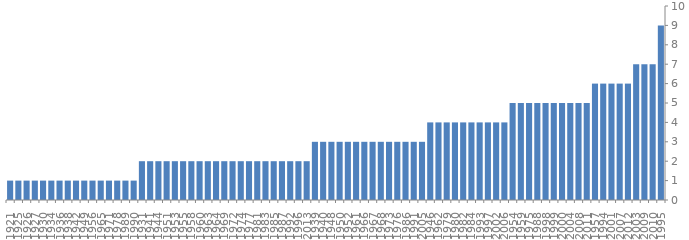
| Category | Series 0 |
|---|---|
| 1995.0 | 9 |
| 2010.0 | 7 |
| 2009.0 | 7 |
| 2003.0 | 7 |
| 2012.0 | 6 |
| 2007.0 | 6 |
| 2001.0 | 6 |
| 1994.0 | 6 |
| 1957.0 | 6 |
| 2011.0 | 5 |
| 2008.0 | 5 |
| 2004.0 | 5 |
| 2000.0 | 5 |
| 1999.0 | 5 |
| 1998.0 | 5 |
| 1988.0 | 5 |
| 1975.0 | 5 |
| 1959.0 | 5 |
| 1954.0 | 5 |
| 2006.0 | 4 |
| 2002.0 | 4 |
| 1997.0 | 4 |
| 1993.0 | 4 |
| 1984.0 | 4 |
| 1982.0 | 4 |
| 1980.0 | 4 |
| 1979.0 | 4 |
| 1962.0 | 4 |
| 1946.0 | 4 |
| 2005.0 | 3 |
| 1991.0 | 3 |
| 1986.0 | 3 |
| 1976.0 | 3 |
| 1973.0 | 3 |
| 1968.0 | 3 |
| 1967.0 | 3 |
| 1966.0 | 3 |
| 1961.0 | 3 |
| 1952.0 | 3 |
| 1950.0 | 3 |
| 1948.0 | 3 |
| 1940.0 | 3 |
| 1939.0 | 3 |
| 2013.0 | 2 |
| 1996.0 | 2 |
| 1992.0 | 2 |
| 1987.0 | 2 |
| 1985.0 | 2 |
| 1983.0 | 2 |
| 1981.0 | 2 |
| 1977.0 | 2 |
| 1974.0 | 2 |
| 1972.0 | 2 |
| 1969.0 | 2 |
| 1964.0 | 2 |
| 1963.0 | 2 |
| 1960.0 | 2 |
| 1958.0 | 2 |
| 1955.0 | 2 |
| 1953.0 | 2 |
| 1951.0 | 2 |
| 1944.0 | 2 |
| 1941.0 | 2 |
| 1931.0 | 2 |
| 1990.0 | 1 |
| 1989.0 | 1 |
| 1978.0 | 1 |
| 1971.0 | 1 |
| 1965.0 | 1 |
| 1956.0 | 1 |
| 1949.0 | 1 |
| 1942.0 | 1 |
| 1938.0 | 1 |
| 1936.0 | 1 |
| 1934.0 | 1 |
| 1930.0 | 1 |
| 1927.0 | 1 |
| 1926.0 | 1 |
| 1925.0 | 1 |
| 1921.0 | 1 |